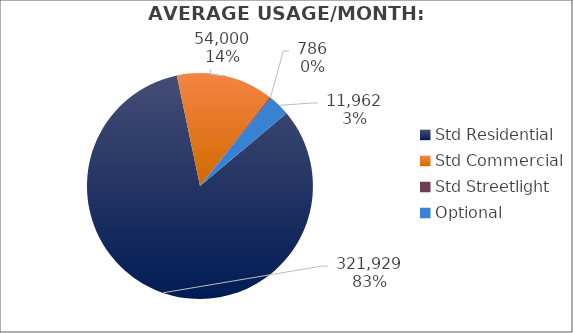
| Category | Usage |
|---|---|
| Std Residential | 321928.667 |
| Std Commercial | 54000 |
| Std Streetlight | 786 |
| Optional | 11962 |